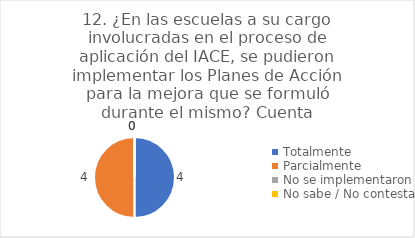
| Category | 12. ¿En las escuelas a su cargo involucradas en el proceso de aplicación del IACE, se pudieron implementar los Planes de Acción para la mejora que se formuló durante el mismo? |
|---|---|
| Totalmente  | 0.5 |
| Parcialmente  | 0.5 |
| No se implementaron  | 0 |
| No sabe / No contesta | 0 |